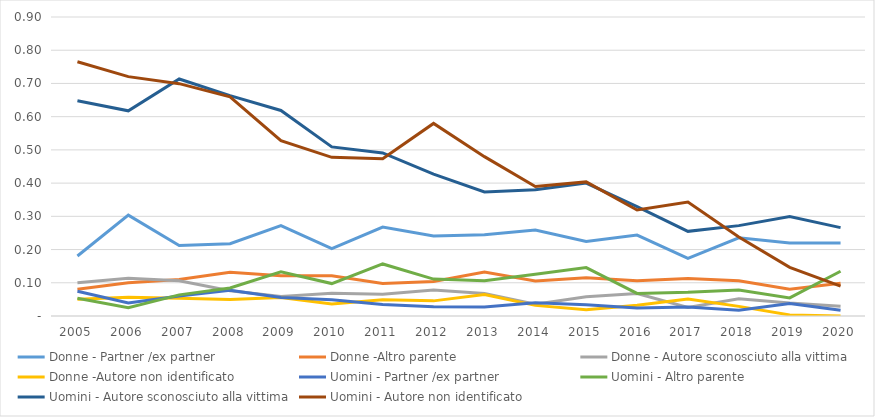
| Category | Donne - Partner /ex partner | Donne -Altro parente | Donne - Autore sconosciuto alla vittima | Donne -Autore non identificato | Uomini - Partner /ex partner | Uomini - Altro parente | Uomini - Autore sconosciuto alla vittima | Uomini - Autore non identificato |
|---|---|---|---|---|---|---|---|---|
| 2005.0 | 0.181 | 0.08 | 0.1 | 0.05 | 0.075 | 0.053 | 0.648 | 0.765 |
| 2006.0 | 0.304 | 0.1 | 0.113 | 0.057 | 0.039 | 0.025 | 0.618 | 0.72 |
| 2007.0 | 0.212 | 0.11 | 0.106 | 0.053 | 0.06 | 0.064 | 0.713 | 0.699 |
| 2008.0 | 0.218 | 0.132 | 0.076 | 0.049 | 0.077 | 0.084 | 0.663 | 0.66 |
| 2009.0 | 0.272 | 0.121 | 0.059 | 0.056 | 0.056 | 0.133 | 0.619 | 0.528 |
| 2010.0 | 0.203 | 0.121 | 0.069 | 0.036 | 0.049 | 0.098 | 0.509 | 0.478 |
| 2011.0 | 0.267 | 0.098 | 0.065 | 0.049 | 0.035 | 0.157 | 0.491 | 0.474 |
| 2012.0 | 0.241 | 0.104 | 0.078 | 0.046 | 0.028 | 0.111 | 0.427 | 0.58 |
| 2013.0 | 0.245 | 0.132 | 0.068 | 0.064 | 0.027 | 0.106 | 0.373 | 0.48 |
| 2014.0 | 0.259 | 0.105 | 0.035 | 0.032 | 0.04 | 0.125 | 0.38 | 0.39 |
| 2015.0 | 0.224 | 0.115 | 0.058 | 0.019 | 0.034 | 0.146 | 0.4 | 0.404 |
| 2016.0 | 0.244 | 0.106 | 0.067 | 0.032 | 0.024 | 0.068 | 0.329 | 0.319 |
| 2017.0 | 0.174 | 0.113 | 0.026 | 0.051 | 0.027 | 0.071 | 0.255 | 0.343 |
| 2018.0 | 0.235 | 0.106 | 0.052 | 0.029 | 0.017 | 0.078 | 0.272 | 0.238 |
| 2019.0 | 0.22 | 0.081 | 0.039 | 0.003 | 0.037 | 0.054 | 0.3 | 0.146 |
| 2020.0 | 0.22 | 0.098 | 0.03 | 0 | 0.017 | 0.135 | 0.266 | 0.09 |